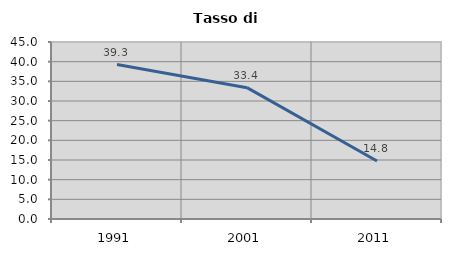
| Category | Tasso di disoccupazione   |
|---|---|
| 1991.0 | 39.255 |
| 2001.0 | 33.386 |
| 2011.0 | 14.76 |